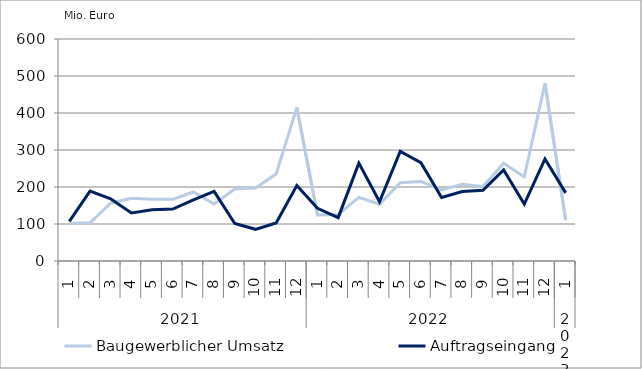
| Category | Baugewerblicher Umsatz | Auftragseingang |
|---|---|---|
| 0 | 101295.895 | 106850.127 |
| 1 | 103236.543 | 188883.434 |
| 2 | 156172.725 | 168204.42 |
| 3 | 169257.088 | 130052.073 |
| 4 | 166897.821 | 138492.214 |
| 5 | 166720.216 | 140262.426 |
| 6 | 186515.191 | 165331.191 |
| 7 | 154188.941 | 188169.655 |
| 8 | 194464.12 | 101359.538 |
| 9 | 197281.201 | 85626.862 |
| 10 | 235325.083 | 102880.924 |
| 11 | 414469.471 | 203900.676 |
| 12 | 124217.549 | 142351.759 |
| 13 | 125619.696 | 117194.423 |
| 14 | 171896.664 | 264509.013 |
| 15 | 153384.654 | 160146.519 |
| 16 | 211335.38 | 295997.826 |
| 17 | 214914.164 | 265813.917 |
| 18 | 192047.613 | 171529.517 |
| 19 | 207577.681 | 187809.656 |
| 20 | 201109.781 | 190941.096 |
| 21 | 264135.048 | 246250.021 |
| 22 | 227299.047 | 153783.993 |
| 23 | 480026.589 | 276019.328 |
| 24 | 110408.991 | 184068.731 |